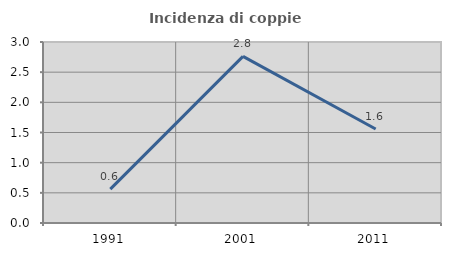
| Category | Incidenza di coppie miste |
|---|---|
| 1991.0 | 0.561 |
| 2001.0 | 2.762 |
| 2011.0 | 1.559 |